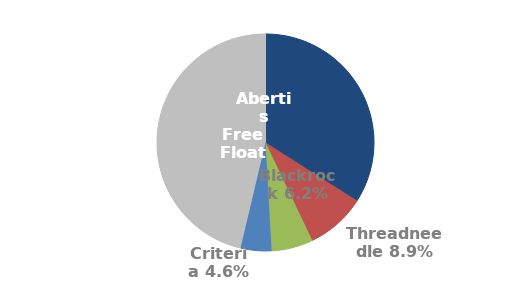
| Category | Series 0 |
|---|---|
| Abertis | 0.34 |
| Threadneedle | 0.089 |
| Blackrock | 0.062 |
| Criteria | 0.046 |
| Free Float | 0.463 |